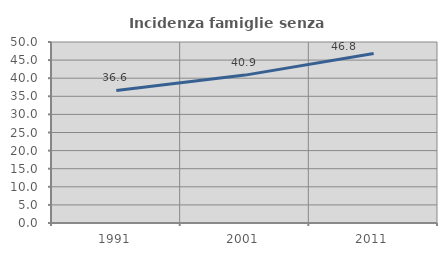
| Category | Incidenza famiglie senza nuclei |
|---|---|
| 1991.0 | 36.608 |
| 2001.0 | 40.855 |
| 2011.0 | 46.843 |